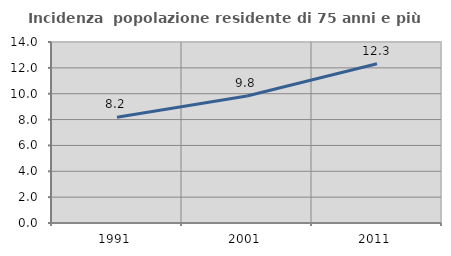
| Category | Incidenza  popolazione residente di 75 anni e più |
|---|---|
| 1991.0 | 8.186 |
| 2001.0 | 9.821 |
| 2011.0 | 12.315 |